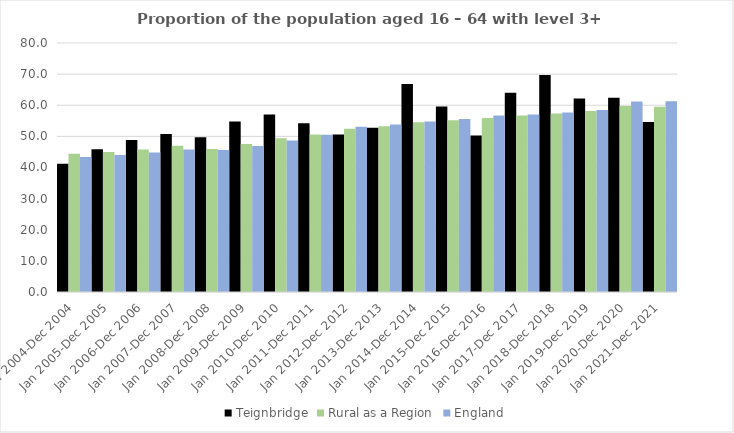
| Category | Teignbridge | Rural as a Region | England |
|---|---|---|---|
| Jan 2004-Dec 2004 | 41.2 | 44.405 | 43.4 |
| Jan 2005-Dec 2005 | 45.9 | 44.973 | 44 |
| Jan 2006-Dec 2006 | 48.8 | 45.774 | 44.8 |
| Jan 2007-Dec 2007 | 50.8 | 46.968 | 45.8 |
| Jan 2008-Dec 2008 | 49.7 | 45.964 | 45.6 |
| Jan 2009-Dec 2009 | 54.8 | 47.59 | 46.9 |
| Jan 2010-Dec 2010 | 57 | 49.362 | 48.7 |
| Jan 2011-Dec 2011 | 54.2 | 50.602 | 50.5 |
| Jan 2012-Dec 2012 | 50.6 | 52.439 | 53.1 |
| Jan 2013-Dec 2013 | 52.8 | 53.276 | 53.8 |
| Jan 2014-Dec 2014 | 66.8 | 54.57 | 54.8 |
| Jan 2015-Dec 2015 | 59.6 | 55.16 | 55.6 |
| Jan 2016-Dec 2016 | 50.3 | 55.941 | 56.7 |
| Jan 2017-Dec 2017 | 64 | 56.689 | 57 |
| Jan 2018-Dec 2018 | 69.7 | 57.389 | 57.7 |
| Jan 2019-Dec 2019 | 62.2 | 58.147 | 58.5 |
| Jan 2020-Dec 2020 | 62.4 | 59.771 | 61.2 |
| Jan 2021-Dec 2021 | 54.6 | 59.54 | 61.3 |